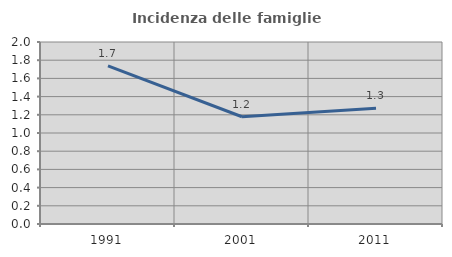
| Category | Incidenza delle famiglie numerose |
|---|---|
| 1991.0 | 1.737 |
| 2001.0 | 1.179 |
| 2011.0 | 1.273 |